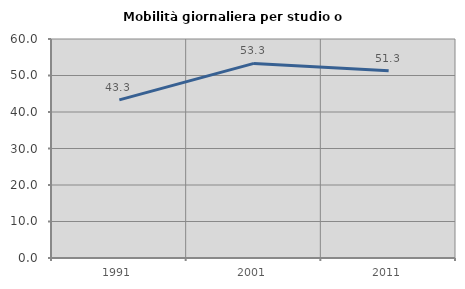
| Category | Mobilità giornaliera per studio o lavoro |
|---|---|
| 1991.0 | 43.325 |
| 2001.0 | 53.309 |
| 2011.0 | 51.299 |